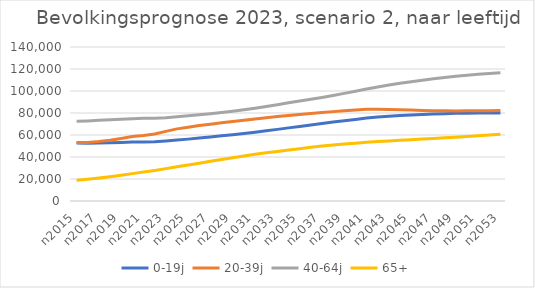
| Category | 0-19j | 20-39j | 40-64j | 65+ |
|---|---|---|---|---|
| n2015 | 52620 | 53075 | 72402 | 18838 |
| n2016 | 52467 | 53236 | 72826 | 19773 |
| n2017 | 52646 | 54074 | 73358 | 20842 |
| n2018 | 52859 | 55229 | 73877 | 22066 |
| n2019 | 53196 | 56878 | 74389 | 23435 |
| n2020 | 53577 | 58541 | 74834 | 24892 |
| n2021 | 53611 | 59548 | 75207 | 26345 |
| n2022 | 53854 | 60864 | 75289 | 27795 |
| n2023 | 54532 | 63299 | 75594 | 29419 |
| n2024 | 55379 | 65573 | 76550 | 31057 |
| n2025 | 56250 | 67082 | 77434 | 32667 |
| n2026 | 57251 | 68653 | 78370 | 34296 |
| n2027 | 58238 | 69872 | 79353 | 36054 |
| n2028 | 59252 | 71091 | 80382 | 37748 |
| n2029 | 60304 | 72171 | 81619 | 39358 |
| n2030 | 61396 | 73392 | 82917 | 40933 |
| n2031 | 62532 | 74526 | 84378 | 42411 |
| n2032 | 63815 | 75634 | 85958 | 43775 |
| n2033 | 65103 | 76731 | 87594 | 45045 |
| n2034 | 66478 | 77696 | 89264 | 46271 |
| n2035 | 67804 | 78677 | 90844 | 47556 |
| n2036 | 69133 | 79575 | 92417 | 48831 |
| n2037 | 70437 | 80440 | 94090 | 49966 |
| n2038 | 71742 | 81246 | 95889 | 50951 |
| n2039 | 73019 | 81987 | 97824 | 51803 |
| n2040 | 74174 | 82779 | 99792 | 52589 |
| n2041 | 75396 | 83337 | 101854 | 53352 |
| n2042 | 76316 | 83441 | 103709 | 54028 |
| n2043 | 77085 | 83243 | 105408 | 54632 |
| n2044 | 77688 | 82898 | 106979 | 55186 |
| n2045 | 78218 | 82642 | 108418 | 55745 |
| n2046 | 78707 | 82314 | 109774 | 56382 |
| n2047 | 79097 | 82101 | 111111 | 56914 |
| n2048 | 79424 | 81974 | 112318 | 57456 |
| n2049 | 79675 | 81930 | 113377 | 58051 |
| n2050 | 79863 | 81958 | 114329 | 58650 |
| n2051 | 79975 | 81937 | 115228 | 59246 |
| n2052 | 80032 | 82037 | 115929 | 59933 |
| n2053 | 80049 | 82230 | 116554 | 60606 |